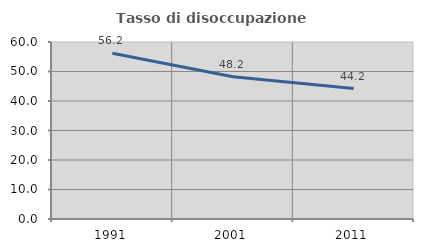
| Category | Tasso di disoccupazione giovanile  |
|---|---|
| 1991.0 | 56.163 |
| 2001.0 | 48.212 |
| 2011.0 | 44.219 |